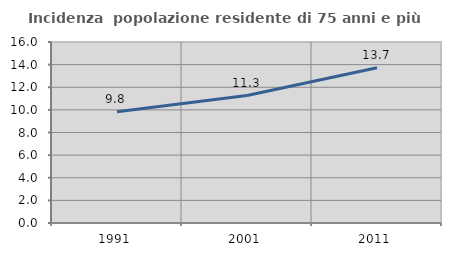
| Category | Incidenza  popolazione residente di 75 anni e più |
|---|---|
| 1991.0 | 9.832 |
| 2001.0 | 11.269 |
| 2011.0 | 13.729 |